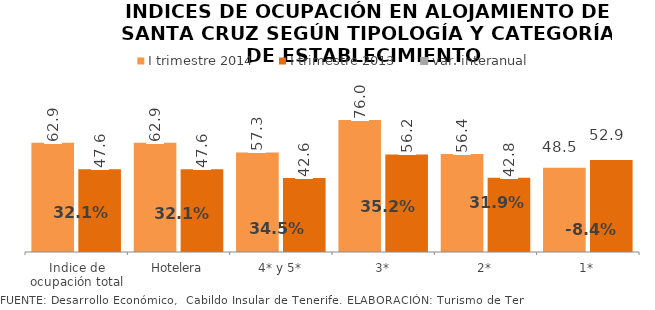
| Category | I trimestre 2014 | I trimestre 2013 |
|---|---|---|
| Indice de ocupación total | 62.852 | 47.575 |
| Hotelera | 62.852 | 47.575 |
| 4* y 5* | 57.3 | 42.602 |
| 3* | 75.955 | 56.162 |
| 2* | 56.424 | 42.784 |
| 1* | 48.487 | 52.945 |